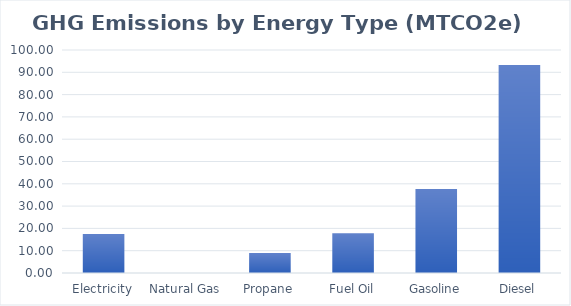
| Category | GHG Emissions (tons) |
|---|---|
| Electricity | 17.533 |
| Natural Gas | 0 |
| Propane | 9.005 |
| Fuel Oil | 17.8 |
| Gasoline | 37.68 |
| Diesel | 93.322 |